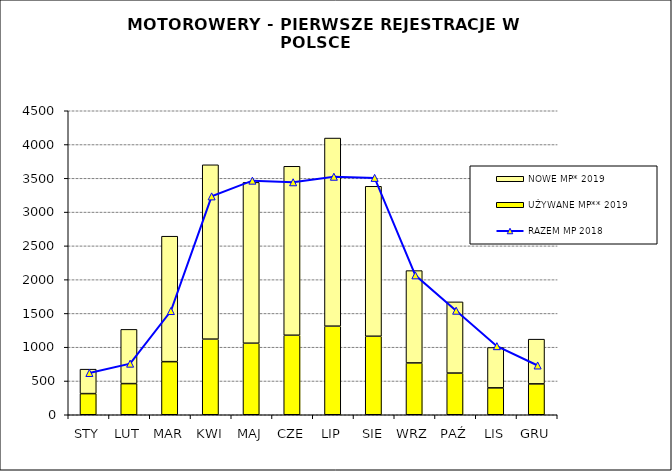
| Category | UŻYWANE MP** 2019 | NOWE MP* 2019 |
|---|---|---|
| STY | 313 | 362 |
| LUT | 461 | 803 |
| MAR | 786 | 1857 |
| KWI | 1119 | 2581 |
| MAJ | 1059 | 2381 |
| CZE | 1177 | 2501 |
| LIP | 1311 | 2785 |
| SIE | 1162 | 2220 |
| WRZ | 767 | 1367 |
| PAŹ | 617 | 1054 |
| LIS | 398 | 598 |
| GRU | 457 | 662 |